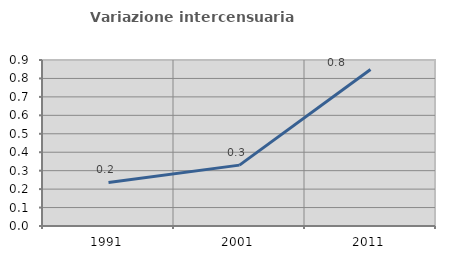
| Category | Variazione intercensuaria annua |
|---|---|
| 1991.0 | 0.236 |
| 2001.0 | 0.33 |
| 2011.0 | 0.848 |